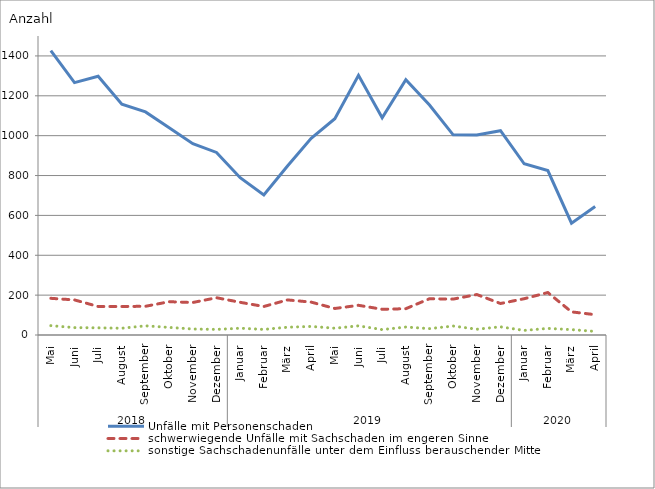
| Category | Unfälle mit Personenschaden | schwerwiegende Unfälle mit Sachschaden im engeren Sinne | sonstige Sachschadenunfälle unter dem Einfluss berauschender Mittel |
|---|---|---|---|
| 0 | 1427 | 184 | 47 |
| 1 | 1266 | 176 | 37 |
| 2 | 1298 | 143 | 36 |
| 3 | 1158 | 143 | 34 |
| 4 | 1119 | 144 | 46 |
| 5 | 1040 | 167 | 38 |
| 6 | 960 | 163 | 30 |
| 7 | 916 | 187 | 28 |
| 8 | 789 | 164 | 34 |
| 9 | 702 | 143 | 28 |
| 10 | 848 | 176 | 39 |
| 11 | 987 | 165 | 43 |
| 12 | 1085 | 133 | 34 |
| 13 | 1303 | 149 | 46 |
| 14 | 1090 | 129 | 27 |
| 15 | 1281 | 132 | 40 |
| 16 | 1154 | 182 | 32 |
| 17 | 1004 | 180 | 45 |
| 18 | 1003 | 203 | 29 |
| 19 | 1025 | 158 | 41 |
| 20 | 859 | 182 | 23 |
| 21 | 825 | 213 | 33 |
| 22 | 561 | 116 | 27 |
| 23 | 645 | 102 | 18 |